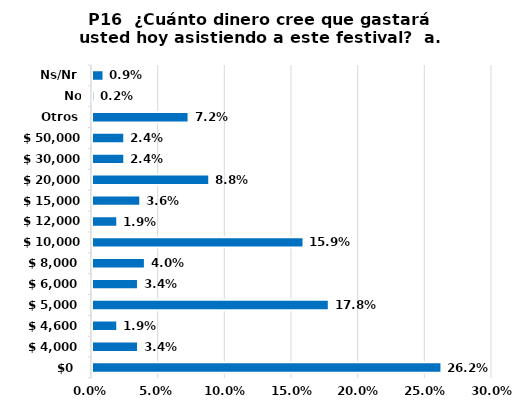
| Category | Series 0 |
|---|---|
| $ 0 | 0.262 |
| $ 4.000 | 0.034 |
| $ 4.600 | 0.019 |
| $ 5.000 | 0.178 |
| $ 6.000 | 0.034 |
| $ 8.000 | 0.04 |
| $ 10.000 | 0.159 |
| $ 12.000 | 0.019 |
| $ 15.000 | 0.036 |
| $ 20.000 | 0.088 |
| $ 30.000 | 0.024 |
| $ 50.000 | 0.024 |
| Otros | 0.072 |
| No aplica | 0.002 |
| Ns/Nr | 0.009 |